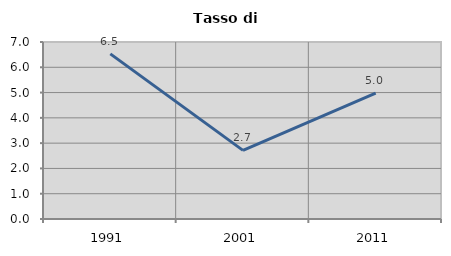
| Category | Tasso di disoccupazione   |
|---|---|
| 1991.0 | 6.531 |
| 2001.0 | 2.713 |
| 2011.0 | 4.982 |